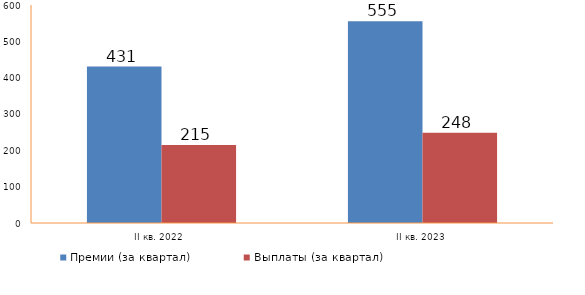
| Category | Премии (за квартал) | Выплаты (за квартал)  |
|---|---|---|
| II кв. 2022 | 430715.739 | 214667.92 |
| II кв. 2023 | 555403.408 | 248389.664 |